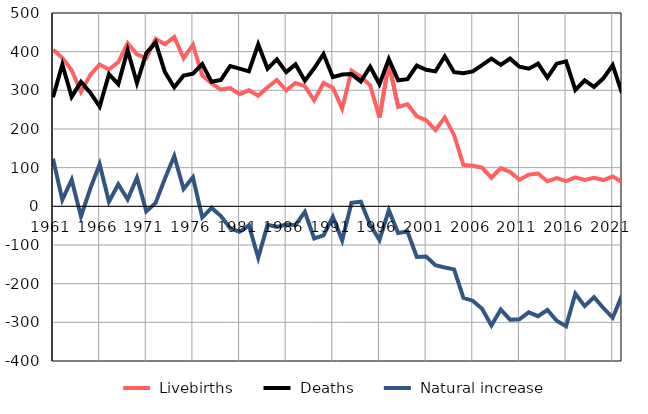
| Category |  Livebirths |  Deaths |  Natural increase |
|---|---|---|---|
| 1961.0 | 405 | 282 | 123 |
| 1962.0 | 384 | 367 | 17 |
| 1963.0 | 352 | 283 | 69 |
| 1964.0 | 296 | 322 | -26 |
| 1965.0 | 340 | 294 | 46 |
| 1966.0 | 367 | 258 | 109 |
| 1967.0 | 354 | 342 | 12 |
| 1968.0 | 373 | 316 | 57 |
| 1969.0 | 422 | 404 | 18 |
| 1970.0 | 393 | 319 | 74 |
| 1971.0 | 383 | 396 | -13 |
| 1972.0 | 433 | 424 | 9 |
| 1973.0 | 419 | 347 | 72 |
| 1974.0 | 438 | 308 | 130 |
| 1975.0 | 383 | 338 | 45 |
| 1976.0 | 418 | 343 | 75 |
| 1977.0 | 339 | 368 | -29 |
| 1978.0 | 318 | 322 | -4 |
| 1979.0 | 302 | 327 | -25 |
| 1980.0 | 306 | 363 | -57 |
| 1981.0 | 290 | 356 | -66 |
| 1982.0 | 300 | 349 | -49 |
| 1983.0 | 286 | 419 | -133 |
| 1984.0 | 308 | 356 | -48 |
| 1985.0 | 327 | 380 | -53 |
| 1986.0 | 300 | 347 | -47 |
| 1987.0 | 319 | 367 | -48 |
| 1988.0 | 311 | 325 | -14 |
| 1989.0 | 274 | 357 | -83 |
| 1990.0 | 319 | 394 | -75 |
| 1991.0 | 307 | 334 | -27 |
| 1992.0 | 253 | 341 | -88 |
| 1993.0 | 351 | 342 | 9 |
| 1994.0 | 335 | 323 | 12 |
| 1995.0 | 313 | 361 | -48 |
| 1996.0 | 229 | 316 | -87 |
| 1997.0 | 371 | 381 | -10 |
| 1998.0 | 257 | 326 | -69 |
| 1999.0 | 264 | 329 | -65 |
| 2000.0 | 233 | 364 | -131 |
| 2001.0 | 223 | 353 | -130 |
| 2002.0 | 197 | 349 | -152 |
| 2003.0 | 230 | 388 | -158 |
| 2004.0 | 184 | 347 | -163 |
| 2005.0 | 107 | 344 | -237 |
| 2006.0 | 105 | 349 | -244 |
| 2007.0 | 100 | 365 | -265 |
| 2008.0 | 74 | 382 | -308 |
| 2009.0 | 99 | 366 | -267 |
| 2010.0 | 89 | 382 | -293 |
| 2011.0 | 69 | 361 | -292 |
| 2012.0 | 82 | 356 | -274 |
| 2013.0 | 85 | 369 | -284 |
| 2014.0 | 65 | 333 | -268 |
| 2015.0 | 73 | 369 | -296 |
| 2016.0 | 65 | 375 | -310 |
| 2017.0 | 75 | 301 | -226 |
| 2018.0 | 68 | 326 | -258 |
| 2019.0 | 74 | 309 | -235 |
| 2020.0 | 68 | 331 | -263 |
| 2021.0 | 77 | 365 | -288 |
| 2022.0 | 63 | 293 | -230 |